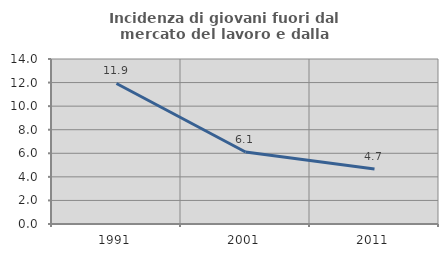
| Category | Incidenza di giovani fuori dal mercato del lavoro e dalla formazione  |
|---|---|
| 1991.0 | 11.925 |
| 2001.0 | 6.105 |
| 2011.0 | 4.657 |